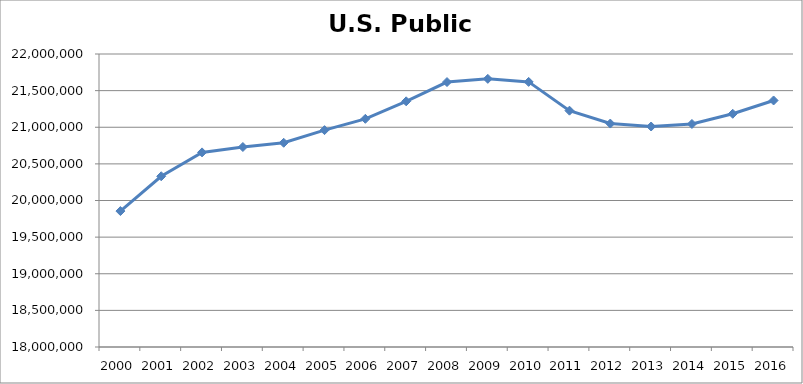
| Category | U.S. |
|---|---|
| 2000 | 19855601 |
| 2001 | 20330998 |
| 2002 | 20656638 |
| 2003 | 20730273 |
| 2004 | 20788110 |
| 2005 | 20960607 |
| 2006 | 21114976 |
| 2007 | 21353885 |
| 2008 | 21617017 |
| 2009 | 21660738 |
| 2010 | 21619210 |
| 2011 | 21226299 |
| 2012 | 21050509 |
| 2013 | 21010100 |
| 2014 | 21044923 |
| 2015 | 21183982 |
| 2016 | 21365592 |